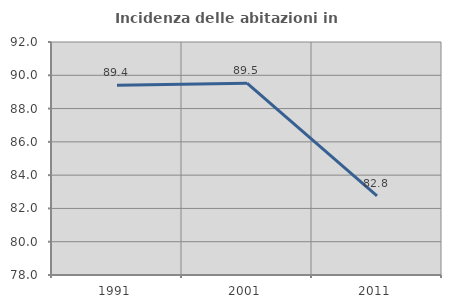
| Category | Incidenza delle abitazioni in proprietà  |
|---|---|
| 1991.0 | 89.398 |
| 2001.0 | 89.529 |
| 2011.0 | 82.759 |